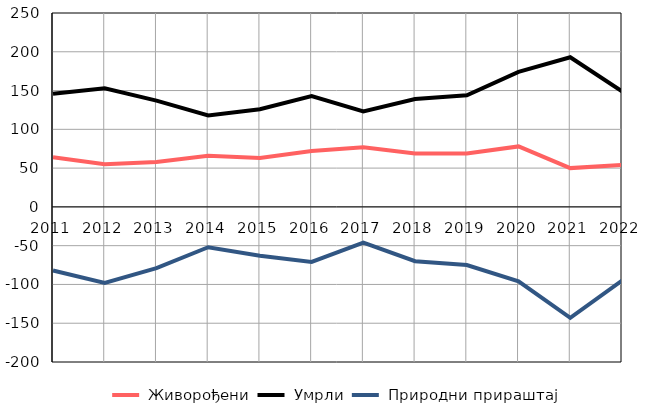
| Category |  Живорођени |  Умрли |  Природни прираштај |
|---|---|---|---|
| 2011.0 | 64 | 146 | -82 |
| 2012.0 | 55 | 153 | -98 |
| 2013.0 | 58 | 137 | -79 |
| 2014.0 | 66 | 118 | -52 |
| 2015.0 | 63 | 126 | -63 |
| 2016.0 | 72 | 143 | -71 |
| 2017.0 | 77 | 123 | -46 |
| 2018.0 | 69 | 139 | -70 |
| 2019.0 | 69 | 144 | -75 |
| 2020.0 | 78 | 174 | -96 |
| 2021.0 | 50 | 193 | -143 |
| 2022.0 | 54 | 149 | -95 |